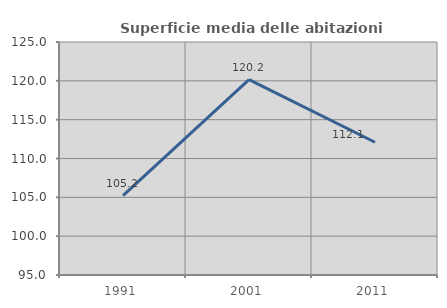
| Category | Superficie media delle abitazioni occupate |
|---|---|
| 1991.0 | 105.216 |
| 2001.0 | 120.159 |
| 2011.0 | 112.091 |